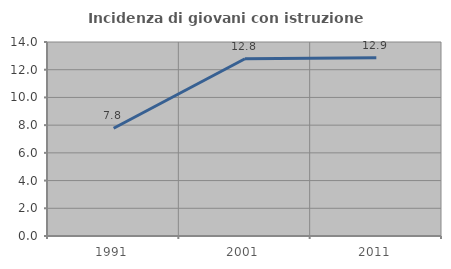
| Category | Incidenza di giovani con istruzione universitaria |
|---|---|
| 1991.0 | 7.778 |
| 2001.0 | 12.791 |
| 2011.0 | 12.857 |